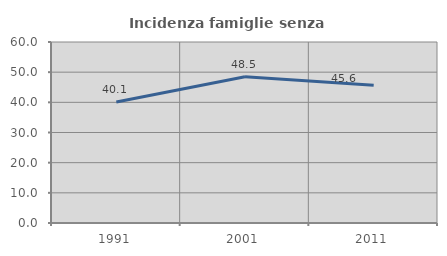
| Category | Incidenza famiglie senza nuclei |
|---|---|
| 1991.0 | 40.107 |
| 2001.0 | 48.5 |
| 2011.0 | 45.641 |